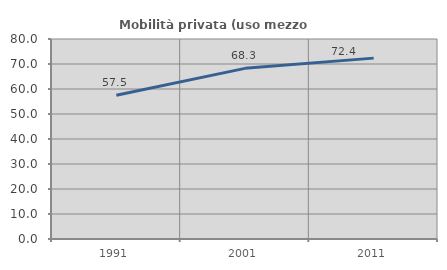
| Category | Mobilità privata (uso mezzo privato) |
|---|---|
| 1991.0 | 57.5 |
| 2001.0 | 68.261 |
| 2011.0 | 72.351 |